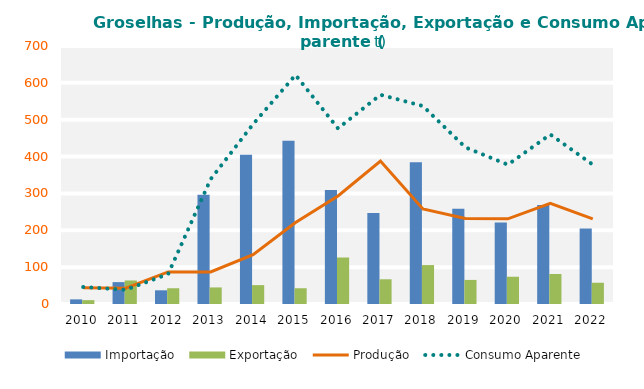
| Category | Importação | Exportação |
|---|---|---|
| 0 | 12.545 | 10.439 |
| 1 | 59.366 | 63.843 |
| 2 | 37.15 | 42.783 |
| 3 | 296.464 | 44.997 |
| 4 | 405.166 | 51.244 |
| 5 | 443.151 | 42.757 |
| 6 | 309.581 | 126.161 |
| 7 | 246.728 | 67.076 |
| 8 | 384.789 | 105.632 |
| 9 | 258.249 | 65.324 |
| 10 | 220.918 | 73.944 |
| 11 | 268.386 | 81.334 |
| 12 | 204.822 | 57.69 |